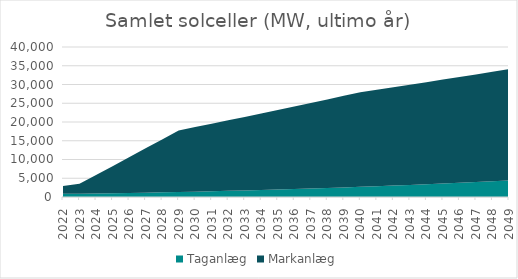
| Category | Taganlæg | Markanlæg |
|---|---|---|
| 2022.0 | 838.64 | 2110.37 |
| 2023.0 | 891.06 | 2610.37 |
| 2024.0 | 949.59 | 4910.37 |
| 2025.0 | 1014.25 | 7210.37 |
| 2026.0 | 1085.02 | 9510.37 |
| 2027.0 | 1161.91 | 11810.37 |
| 2028.0 | 1244.92 | 14110.37 |
| 2029.0 | 1334.04 | 16410.37 |
| 2030.0 | 1429.28 | 17210.37 |
| 2031.0 | 1530.64 | 18010.37 |
| 2032.0 | 1638.12 | 18810.37 |
| 2033.0 | 1751.71 | 19610.37 |
| 2034.0 | 1871.43 | 20410.37 |
| 2035.0 | 1997.26 | 21210.37 |
| 2036.0 | 2129.21 | 22010.37 |
| 2037.0 | 2267.27 | 22810.37 |
| 2038.0 | 2411.46 | 23610.37 |
| 2039.0 | 2561.76 | 24410.37 |
| 2040.0 | 2718.18 | 25210.37 |
| 2041.0 | 2880.71 | 25710.37 |
| 2042.0 | 3049.37 | 26210.37 |
| 2043.0 | 3224.14 | 26710.37 |
| 2044.0 | 3405.03 | 27210.37 |
| 2045.0 | 3592.04 | 27710.37 |
| 2046.0 | 3785.16 | 28210.37 |
| 2047.0 | 3984.41 | 28710.37 |
| 2048.0 | 4189.77 | 29210.37 |
| 2049.0 | 4401.24 | 29710.37 |